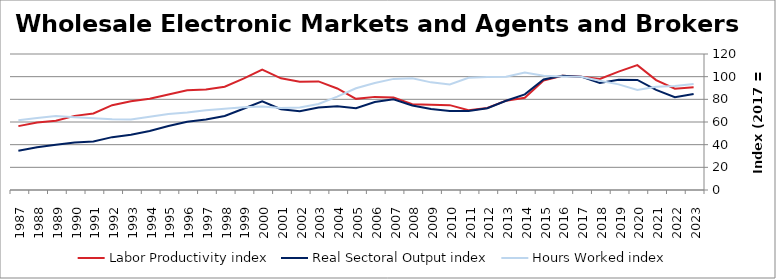
| Category | Labor Productivity index | Real Sectoral Output index | Hours Worked index |
|---|---|---|---|
| 2023.0 | 90.713 | 84.763 | 93.441 |
| 2022.0 | 89.373 | 81.932 | 91.675 |
| 2021.0 | 96.928 | 88.281 | 91.079 |
| 2020.0 | 110.138 | 97.122 | 88.182 |
| 2019.0 | 104.452 | 97.342 | 93.193 |
| 2018.0 | 98.033 | 94.517 | 96.413 |
| 2017.0 | 100 | 100 | 100 |
| 2016.0 | 100.707 | 100.818 | 100.111 |
| 2015.0 | 96.637 | 97.463 | 100.854 |
| 2014.0 | 81.385 | 84.409 | 103.716 |
| 2013.0 | 78.838 | 78.743 | 99.88 |
| 2012.0 | 72.383 | 72.13 | 99.651 |
| 2011.0 | 70.483 | 69.753 | 98.964 |
| 2010.0 | 74.888 | 69.794 | 93.198 |
| 2009.0 | 75.235 | 71.457 | 94.977 |
| 2008.0 | 75.665 | 74.578 | 98.563 |
| 2007.0 | 81.679 | 80.084 | 98.047 |
| 2006.0 | 82.166 | 77.592 | 94.433 |
| 2005.0 | 80.413 | 72.219 | 89.81 |
| 2004.0 | 89.584 | 73.819 | 82.401 |
| 2003.0 | 95.823 | 72.764 | 75.937 |
| 2002.0 | 95.583 | 69.556 | 72.77 |
| 2001.0 | 98.548 | 71.282 | 72.332 |
| 2000.0 | 106.197 | 78.194 | 73.631 |
| 1999.0 | 98.257 | 71.725 | 72.997 |
| 1998.0 | 91.119 | 65.315 | 71.681 |
| 1997.0 | 88.623 | 62.294 | 70.291 |
| 1996.0 | 87.983 | 60.149 | 68.365 |
| 1995.0 | 84.225 | 56.409 | 66.974 |
| 1994.0 | 80.577 | 52.043 | 64.587 |
| 1993.0 | 78.366 | 48.745 | 62.202 |
| 1992.0 | 74.851 | 46.647 | 62.32 |
| 1991.0 | 67.517 | 42.806 | 63.401 |
| 1990.0 | 65.409 | 41.969 | 64.164 |
| 1989.0 | 61.043 | 39.842 | 65.269 |
| 1988.0 | 59.489 | 37.753 | 63.462 |
| 1987.0 | 56.355 | 34.628 | 61.445 |